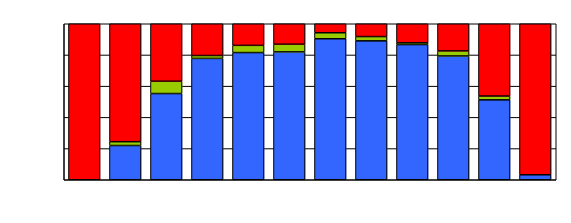
| Category | Series 0 | Series 1 | Series 2 |
|---|---|---|---|
| 0 | 0 | 0 | 130 |
| 1 | 9 | 1 | 31 |
| 2 | 21 | 3 | 14 |
| 3 | 42 | 1 | 11 |
| 4 | 53 | 3 | 9 |
| 5 | 50 | 3 | 8 |
| 6 | 47 | 2 | 3 |
| 7 | 65 | 2 | 6 |
| 8 | 78 | 1 | 11 |
| 9 | 73 | 3 | 16 |
| 10 | 42 | 2 | 38 |
| 11 | 9 | 0 | 274 |